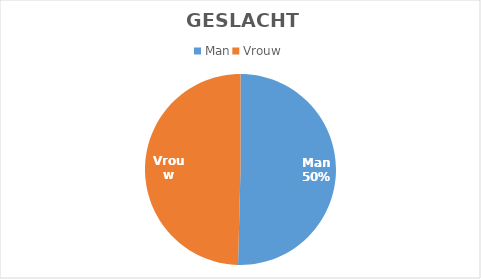
| Category | Series 0 |
|---|---|
| Man | 122 |
| Vrouw | 120 |